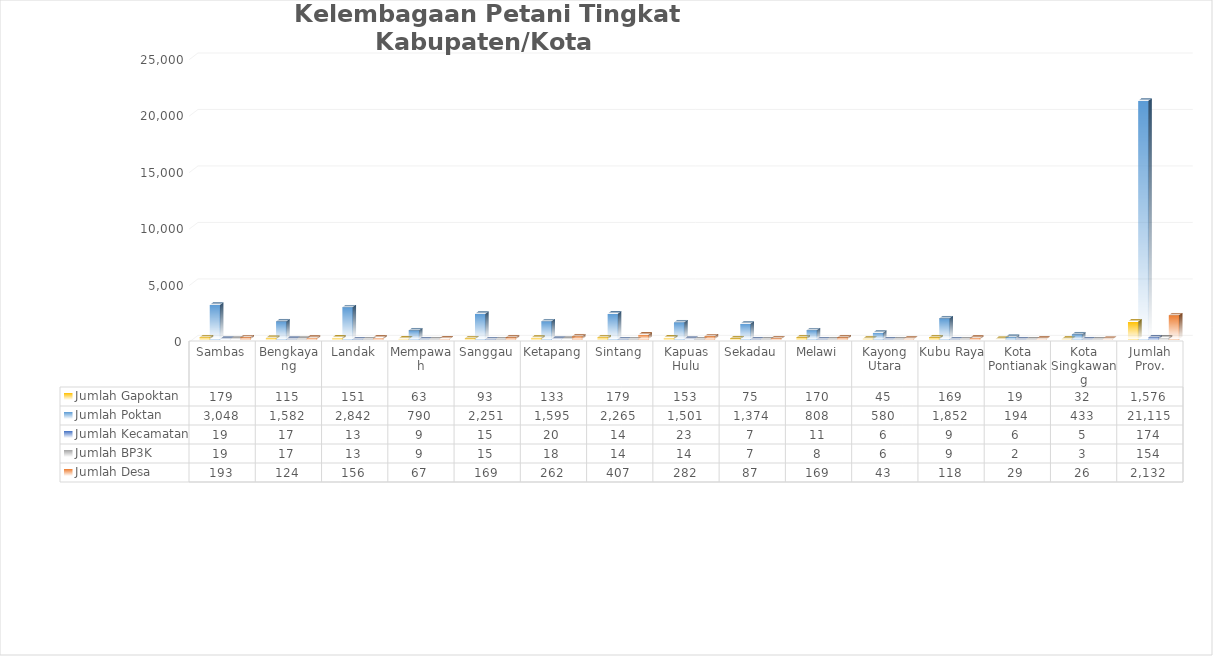
| Category | Jumlah Gapoktan | Jumlah Poktan | Jumlah Kecamatan | Jumlah BP3K | Jumlah Desa |
|---|---|---|---|---|---|
| Sambas | 179 | 3048 | 19 | 19 | 193 |
| Bengkayang | 115 | 1582 | 17 | 17 | 124 |
| Landak | 151 | 2842 | 13 | 13 | 156 |
| Mempawah | 63 | 790 | 9 | 9 | 67 |
| Sanggau | 93 | 2251 | 15 | 15 | 169 |
| Ketapang | 133 | 1595 | 20 | 18 | 262 |
| Sintang | 179 | 2265 | 14 | 14 | 407 |
| Kapuas Hulu | 153 | 1501 | 23 | 14 | 282 |
| Sekadau | 75 | 1374 | 7 | 7 | 87 |
| Melawi | 170 | 808 | 11 | 8 | 169 |
| Kayong Utara | 45 | 580 | 6 | 6 | 43 |
| Kubu Raya | 169 | 1852 | 9 | 9 | 118 |
| Kota Pontianak | 19 | 194 | 6 | 2 | 29 |
| Kota Singkawang | 32 | 433 | 5 | 3 | 26 |
| Jumlah Prov. | 1576 | 21115 | 174 | 154 | 2132 |